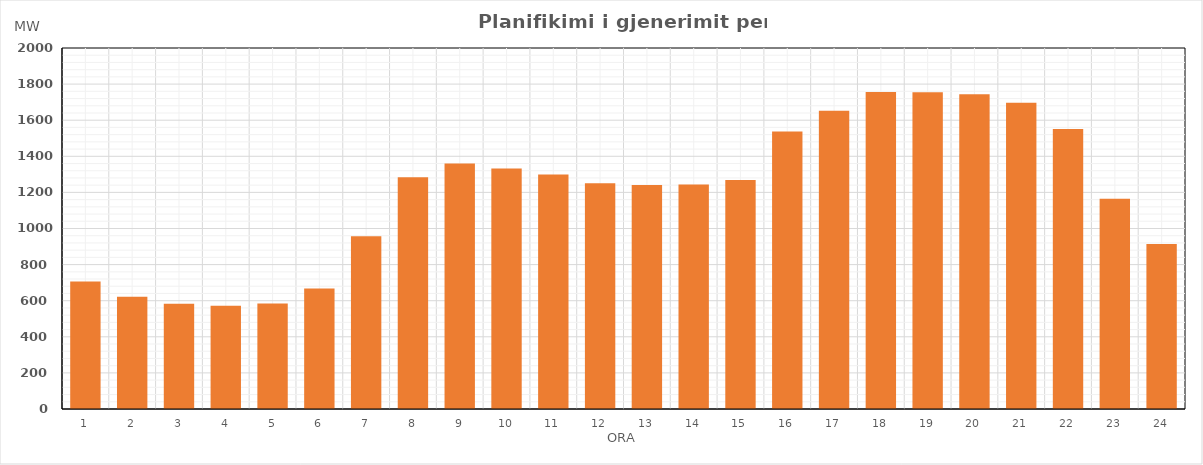
| Category | Max (MW) |
|---|---|
| 0 | 706.63 |
| 1 | 621.63 |
| 2 | 583.24 |
| 3 | 571.87 |
| 4 | 583.82 |
| 5 | 666.97 |
| 6 | 957.47 |
| 7 | 1283.56 |
| 8 | 1360.6 |
| 9 | 1332.55 |
| 10 | 1299.82 |
| 11 | 1250.03 |
| 12 | 1241.43 |
| 13 | 1244.22 |
| 14 | 1268.78 |
| 15 | 1537.71 |
| 16 | 1652.46 |
| 17 | 1756.12 |
| 18 | 1755.34 |
| 19 | 1744.14 |
| 20 | 1697.15 |
| 21 | 1551.77 |
| 22 | 1165.13 |
| 23 | 913.88 |